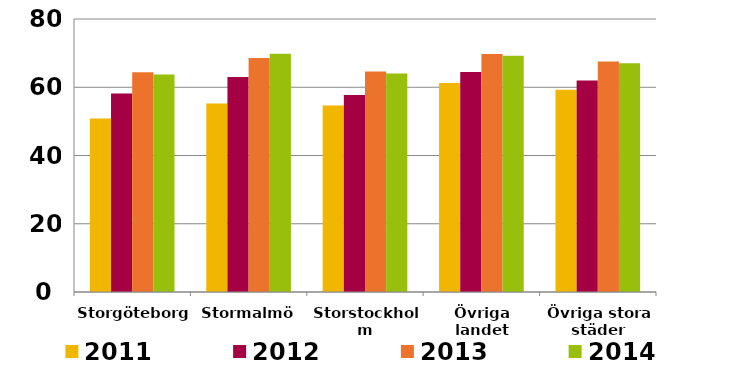
| Category | 2011 | 2012 | 2013 | 2014 |
|---|---|---|---|---|
| Storgöteborg | 50.864 | 58.166 | 64.406 | 63.727 |
| Stormalmö | 55.209 | 62.977 | 68.57 | 69.846 |
| Storstockholm | 54.645 | 57.701 | 64.606 | 64.046 |
| Övriga landet | 61.247 | 64.47 | 69.768 | 69.213 |
| Övriga stora städer | 59.29 | 61.95 | 67.573 | 67.036 |